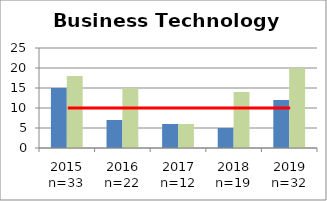
| Category | AC | BA |
|---|---|---|
| 2015 n=33 | 15 | 18 |
| 2016 n=22 | 7 | 15 |
| 2017 n=12 | 6 | 6 |
| 2018 n=19 | 5 | 14 |
| 2019 n=32 | 12 | 20 |